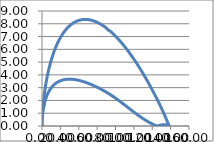
| Category | Series 0 |
|---|---|
| 138.5138 | 0 |
| 138.376671338 | 0.019 |
| 137.968055628 | 0.082 |
| 137.286567732 | 0.194 |
| 136.337748202 | 0.356 |
| 135.12436731399998 | 0.565 |
| 133.650580482 | 0.814 |
| 131.921928258 | 1.096 |
| 129.94672147 | 1.4 |
| 127.73188580799999 | 1.73 |
| 125.28711723800001 | 2.083 |
| 122.62072658800001 | 2.46 |
| 119.742409824 | 2.856 |
| 116.666018326 | 3.265 |
| 113.40263319800002 | 3.683 |
| 109.96472068199999 | 4.107 |
| 106.366132158 | 4.531 |
| 102.62210414399999 | 4.952 |
| 98.74510288200001 | 5.365 |
| 94.751750028 | 5.765 |
| 90.65866723800002 | 6.15 |
| 86.506023514 | 6.517 |
| 82.23425792200001 | 6.861 |
| 77.937559846 | 7.176 |
| 73.60623332 | 7.46 |
| 72.397007846 | 7.494 |
| 69.2569 | 7.711 |
| 64.908951818 | 7.923 |
| 60.576240154 | 8.095 |
| 56.279542078000006 | 8.224 |
| 52.034094108000005 | 8.305 |
| 47.855132762000004 | 8.34 |
| 43.76204997200001 | 8.323 |
| 39.768697118 | 8.258 |
| 35.891695856000005 | 8.139 |
| 32.147667842000004 | 7.966 |
| 28.549079317999993 | 7.742 |
| 25.111166802000003 | 7.465 |
| 21.847781674000004 | 7.135 |
| 18.771390176 | 6.754 |
| 15.893073412000001 | 6.325 |
| 13.226682762000003 | 5.849 |
| 10.781914192000002 | 5.331 |
| 8.567078530000002 | 4.775 |
| 6.591871742 | 4.185 |
| 4.863219518 | 3.564 |
| 3.389432686 | 2.924 |
| 2.1760517979999996 | 2.277 |
| 1.227232268 | 1.64 |
| 0.545744372 | 1.028 |
| 0.137128662 | 0.463 |
| 0.0 | 0 |
| 0.137128662 | 0.391 |
| 0.545744372 | 0.817 |
| 1.227232268 | 1.224 |
| 2.3145655979999997 | 1.605 |
| 3.389432686 | 1.964 |
| 4.863219518 | 2.292 |
| 6.591871742 | 2.582 |
| 8.567078530000002 | 2.837 |
| 10.781914192000002 | 3.056 |
| 13.226682762000003 | 3.238 |
| 15.893073412000001 | 3.388 |
| 18.771390176 | 3.503 |
| 21.847781674000004 | 3.588 |
| 25.111166802000003 | 3.64 |
| 28.549079317999993 | 3.664 |
| 32.147667842000004 | 3.66 |
| 35.891695856000005 | 3.63 |
| 39.768697118 | 3.578 |
| 43.76204997200001 | 3.502 |
| 47.855132762000004 | 3.406 |
| 52.034094108000005 | 3.291 |
| 56.279542078000006 | 3.159 |
| 60.576240154 | 3.013 |
| 64.910336956 | 2.851 |
| 69.2569 | 2.676 |
| 73.60623332 | 2.488 |
| 77.937559846 | 2.284 |
| 82.23425792200001 | 2.067 |
| 86.48109102999999 | 1.838 |
| 90.65866723800002 | 1.607 |
| 94.751750028 | 1.38 |
| 98.74510288200001 | 1.159 |
| 102.62210414399999 | 0.949 |
| 106.366132158 | 0.755 |
| 109.96472068199999 | 0.579 |
| 113.40263319800002 | 0.421 |
| 116.666018326 | 0.284 |
| 119.742409824 | 0.169 |
| 122.63457796800002 | 0.075 |
| 125.28711723800001 | 0.003 |
| 127.73188580799999 | 0.05 |
| 129.94672147 | 0.083 |
| 131.921928258 | 0.098 |
| 133.650580482 | 0.1 |
| 135.12436731399998 | 0.089 |
| 136.337748202 | 0.071 |
| 137.286567732 | 0.047 |
| 137.968055628 | 0.025 |
| 138.376671338 | 0.007 |
| 138.5138 | 0 |